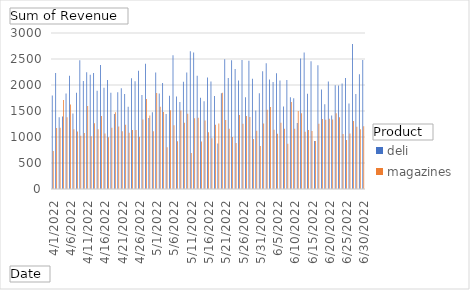
| Category | deli | magazines |
|---|---|---|
| 4/1/2022 | 1796.19 | 730.948 |
| 4/2/2022 | 2229.496 | 1171.005 |
| 4/3/2022 | 1380.572 | 1179.85 |
| 4/4/2022 | 1395.057 | 1711.502 |
| 4/5/2022 | 1834.754 | 1378.039 |
| 4/6/2022 | 2180.139 | 1625.23 |
| 4/7/2022 | 1451.616 | 1149.098 |
| 4/8/2022 | 1848.869 | 1107.595 |
| 4/9/2022 | 2477.855 | 1026.004 |
| 4/10/2022 | 2076.252 | 1078.909 |
| 4/11/2022 | 2243.857 | 1597.289 |
| 4/12/2022 | 2197.249 | 1013.94 |
| 4/13/2022 | 2228.529 | 1264.597 |
| 4/14/2022 | 1891.578 | 1150.331 |
| 4/15/2022 | 2385.585 | 1404.038 |
| 4/16/2022 | 1949.256 | 1065.061 |
| 4/17/2022 | 2097.482 | 993.711 |
| 4/18/2022 | 1853.147 | 1176.414 |
| 4/19/2022 | 1443.349 | 1473.688 |
| 4/20/2022 | 1862.84 | 1200.101 |
| 4/21/2022 | 1936.646 | 1111.94 |
| 4/22/2022 | 1827.772 | 1234.59 |
| 4/23/2022 | 1580.049 | 1082.836 |
| 4/24/2022 | 2131.004 | 1134.815 |
| 4/25/2022 | 2071.085 | 1136.71 |
| 4/26/2022 | 2274.86 | 1005.117 |
| 4/27/2022 | 1805.726 | 1337.057 |
| 4/28/2022 | 2409.309 | 1730.235 |
| 4/29/2022 | 1367.119 | 1413.476 |
| 4/30/2022 | 1477.314 | 1108.83 |
| 5/1/2022 | 2242.323 | 1843.783 |
| 5/2/2022 | 1835.638 | 1580.64 |
| 5/3/2022 | 2037.276 | 1481.596 |
| 5/4/2022 | 1442.449 | 803.738 |
| 5/5/2022 | 1791.981 | 1513.322 |
| 5/6/2022 | 2571.416 | 1224.769 |
| 5/7/2022 | 1779.603 | 917.77 |
| 5/8/2022 | 1672.054 | 1509.89 |
| 5/9/2022 | 2060.965 | 1273.583 |
| 5/10/2022 | 2241.712 | 1446.344 |
| 5/11/2022 | 2649.142 | 693.799 |
| 5/12/2022 | 2624.189 | 1360.764 |
| 5/13/2022 | 2178.764 | 1367.949 |
| 5/14/2022 | 1756.059 | 912.234 |
| 5/15/2022 | 1686.641 | 1319.276 |
| 5/16/2022 | 2143.749 | 1091.531 |
| 5/17/2022 | 2066.962 | 973.997 |
| 5/18/2022 | 1790.208 | 1236.73 |
| 5/19/2022 | 876.578 | 1261.443 |
| 5/20/2022 | 1842.295 | 1851.434 |
| 5/21/2022 | 2495.823 | 1324.754 |
| 5/22/2022 | 2136.239 | 1156.625 |
| 5/23/2022 | 2477.26 | 999.557 |
| 5/24/2022 | 2307.418 | 883.099 |
| 5/25/2022 | 2086.274 | 1420.847 |
| 5/26/2022 | 2481.085 | 1256.508 |
| 5/27/2022 | 1762.961 | 1405.457 |
| 5/28/2022 | 2464.035 | 1386.638 |
| 5/29/2022 | 2119.6 | 961.463 |
| 5/30/2022 | 1509.863 | 1121.501 |
| 5/31/2022 | 1841.932 | 825.599 |
| 6/1/2022 | 2264.2 | 1258.517 |
| 6/2/2022 | 2418.188 | 1525.947 |
| 6/3/2022 | 2105.169 | 1577.058 |
| 6/4/2022 | 2059.906 | 1141.102 |
| 6/5/2022 | 2224.145 | 1064.74 |
| 6/6/2022 | 2088.117 | 1273.162 |
| 6/7/2022 | 1588.484 | 1157.328 |
| 6/8/2022 | 2093.914 | 868.93 |
| 6/9/2022 | 1764.08 | 1672.394 |
| 6/10/2022 | 1746.594 | 1158.779 |
| 6/11/2022 | 1270.092 | 1502.148 |
| 6/12/2022 | 2511.819 | 1456.252 |
| 6/13/2022 | 2624.125 | 1100.344 |
| 6/14/2022 | 1832.646 | 1132.577 |
| 6/15/2022 | 2456.69 | 1117.747 |
| 6/16/2022 | 925.107 | 922.814 |
| 6/17/2022 | 2378.312 | 1254.965 |
| 6/18/2022 | 1914.498 | 1347.33 |
| 6/19/2022 | 1631.758 | 1330.422 |
| 6/20/2022 | 2068.109 | 1350.1 |
| 6/21/2022 | 1411.643 | 1337.501 |
| 6/22/2022 | 1995.024 | 1457.141 |
| 6/23/2022 | 1991.771 | 1378.208 |
| 6/24/2022 | 2028.166 | 1055.852 |
| 6/25/2022 | 2136.208 | 943.858 |
| 6/26/2022 | 1643.226 | 1067.157 |
| 6/27/2022 | 2790.74 | 1305.582 |
| 6/28/2022 | 1825.02 | 1197.028 |
| 6/29/2022 | 2207.61 | 1149.313 |
| 6/30/2022 | 2480.066 | 1206.956 |